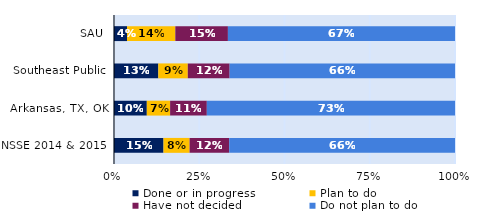
| Category | Done or in progress | Plan to do | Have not decided | Do not plan to do |
|---|---|---|---|---|
| SAU | 0.038 | 0.142 | 0.154 | 0.666 |
| Southeast Public | 0.13 | 0.086 | 0.123 | 0.661 |
| Arkansas, TX, OK | 0.096 | 0.068 | 0.108 | 0.728 |
| NSSE 2014 & 2015 | 0.145 | 0.077 | 0.116 | 0.662 |